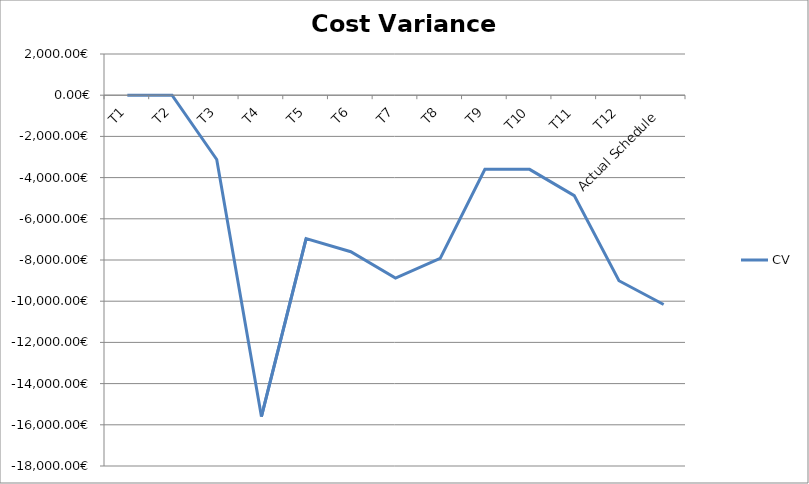
| Category | CV |
|---|---|
| T1 | 0 |
| T2 | 0 |
| T3 | -3120 |
| T4 | -15600 |
| T5 | -6960 |
| T6 | -7600 |
| T7 | -8880 |
| T8 | -7920 |
| T9 | -3600 |
| T10 | -3600 |
| T11 | -4874.666 |
| T12 | -9008 |
| Actual Schedule | -10160 |